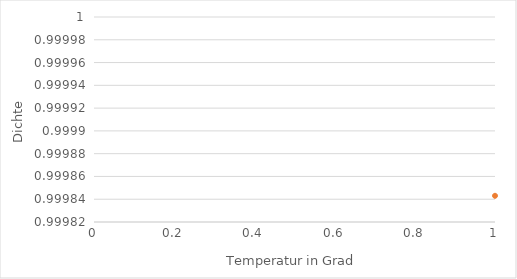
| Category | Series 1 |
|---|---|
| 0 | 1 |
| 1 | 1 |
| 2 | 1 |
| 3 | 1 |
| 4 | 1 |
| 5 | 1 |
| 6 | 1 |
| 7 | 1 |
| 8 | 1 |